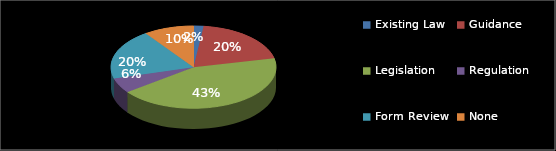
| Category | Series 0 |
|---|---|
| Existing Law | 1 |
| Guidance | 10 |
| Legislation | 22 |
| Regulation | 3 |
| Form Review | 10 |
| None | 5 |